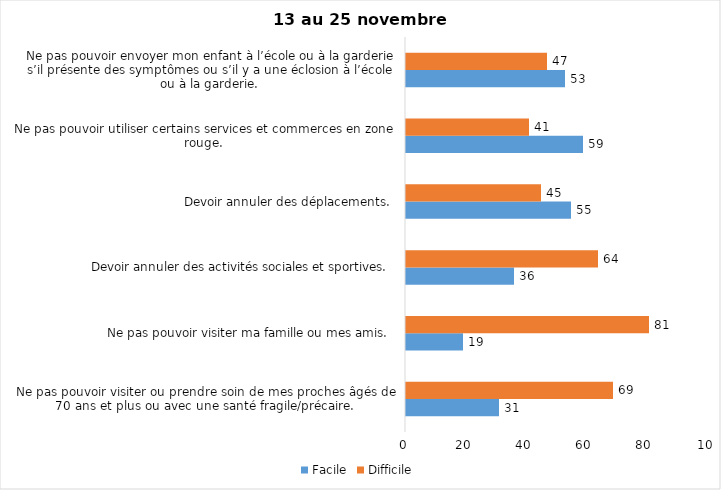
| Category | Facile | Difficile |
|---|---|---|
| Ne pas pouvoir visiter ou prendre soin de mes proches âgés de 70 ans et plus ou avec une santé fragile/précaire.  | 31 | 69 |
| Ne pas pouvoir visiter ma famille ou mes amis.  | 19 | 81 |
| Devoir annuler des activités sociales et sportives.  | 36 | 64 |
| Devoir annuler des déplacements.  | 55 | 45 |
| Ne pas pouvoir utiliser certains services et commerces en zone rouge.  | 59 | 41 |
| Ne pas pouvoir envoyer mon enfant à l’école ou à la garderie s’il présente des symptômes ou s’il y a une éclosion à l’école ou à la garderie.  | 53 | 47 |